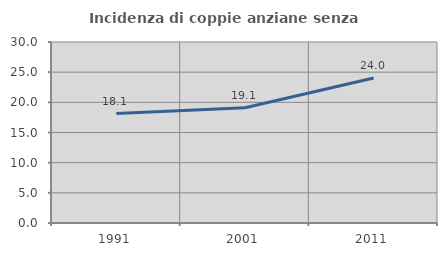
| Category | Incidenza di coppie anziane senza figli  |
|---|---|
| 1991.0 | 18.137 |
| 2001.0 | 19.108 |
| 2011.0 | 24.031 |